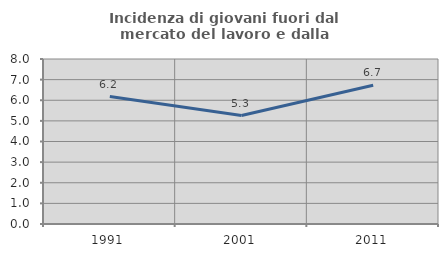
| Category | Incidenza di giovani fuori dal mercato del lavoro e dalla formazione  |
|---|---|
| 1991.0 | 6.181 |
| 2001.0 | 5.259 |
| 2011.0 | 6.729 |